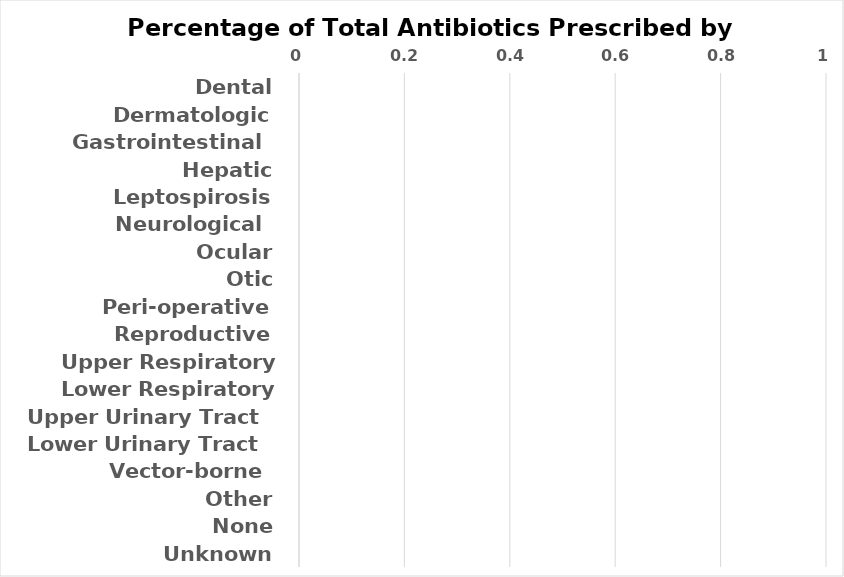
| Category | #DIV/0! |
|---|---|
| Dental | 0 |
| Dermatologic | 0 |
| Gastrointestinal  | 0 |
| Hepatic | 0 |
| Leptospirosis | 0 |
| Neurological  | 0 |
| Ocular | 0 |
| Otic | 0 |
| Peri-operative | 0 |
| Reproductive | 0 |
| Upper Respiratory Tract  | 0 |
| Lower Respiratory Tract  | 0 |
| Upper Urinary Tract  | 0 |
| Lower Urinary Tract  | 0 |
| Vector-borne  | 0 |
| Other | 0 |
| None | 0 |
| Unknown | 0 |